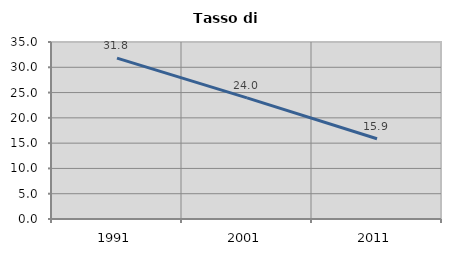
| Category | Tasso di disoccupazione   |
|---|---|
| 1991.0 | 31.799 |
| 2001.0 | 23.952 |
| 2011.0 | 15.878 |